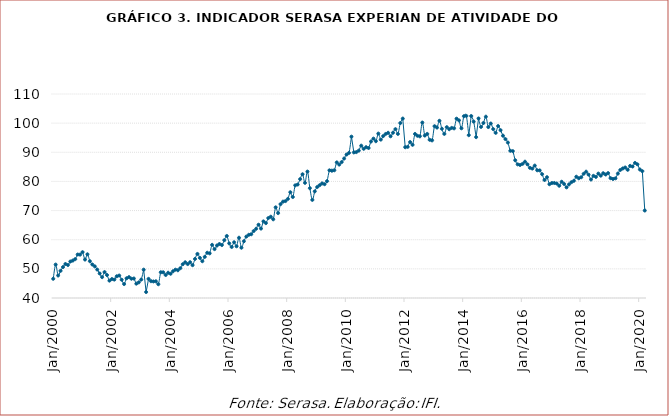
| Category | Indicador Serasa Experian de Atividade do Comércio |
|---|---|
| 2000-01-01 | 46.593 |
| 2000-02-01 | 51.465 |
| 2000-03-01 | 47.726 |
| 2000-04-01 | 49.323 |
| 2000-05-01 | 50.605 |
| 2000-06-01 | 51.668 |
| 2000-07-01 | 51.314 |
| 2000-08-01 | 52.513 |
| 2000-09-01 | 52.838 |
| 2000-10-01 | 53.339 |
| 2000-11-01 | 54.915 |
| 2000-12-01 | 54.885 |
| 2001-01-01 | 55.739 |
| 2001-02-01 | 53.199 |
| 2001-03-01 | 54.998 |
| 2001-04-01 | 52.62 |
| 2001-05-01 | 51.493 |
| 2001-06-01 | 50.86 |
| 2001-07-01 | 49.758 |
| 2001-08-01 | 48.418 |
| 2001-09-01 | 47.156 |
| 2001-10-01 | 48.903 |
| 2001-11-01 | 47.877 |
| 2001-12-01 | 45.954 |
| 2002-01-01 | 46.509 |
| 2002-02-01 | 46.311 |
| 2002-03-01 | 47.456 |
| 2002-04-01 | 47.695 |
| 2002-05-01 | 46.264 |
| 2002-06-01 | 44.786 |
| 2002-07-01 | 46.767 |
| 2002-08-01 | 47.166 |
| 2002-09-01 | 46.613 |
| 2002-10-01 | 46.681 |
| 2002-11-01 | 44.919 |
| 2002-12-01 | 45.37 |
| 2003-01-01 | 46.32 |
| 2003-02-01 | 49.722 |
| 2003-03-01 | 42.045 |
| 2003-04-01 | 46.567 |
| 2003-05-01 | 45.77 |
| 2003-06-01 | 45.681 |
| 2003-07-01 | 45.727 |
| 2003-08-01 | 44.732 |
| 2003-09-01 | 48.82 |
| 2003-10-01 | 48.819 |
| 2003-11-01 | 47.889 |
| 2003-12-01 | 48.665 |
| 2004-01-01 | 48.314 |
| 2004-02-01 | 49.176 |
| 2004-03-01 | 49.718 |
| 2004-04-01 | 49.525 |
| 2004-05-01 | 50.23 |
| 2004-06-01 | 51.596 |
| 2004-07-01 | 52.252 |
| 2004-08-01 | 51.641 |
| 2004-09-01 | 52.28 |
| 2004-10-01 | 51.261 |
| 2004-11-01 | 53.407 |
| 2004-12-01 | 55.122 |
| 2005-01-01 | 53.759 |
| 2005-02-01 | 52.626 |
| 2005-03-01 | 54.126 |
| 2005-04-01 | 55.519 |
| 2005-05-01 | 55.317 |
| 2005-06-01 | 58.235 |
| 2005-07-01 | 56.772 |
| 2005-08-01 | 58.013 |
| 2005-09-01 | 58.529 |
| 2005-10-01 | 58.165 |
| 2005-11-01 | 59.835 |
| 2005-12-01 | 61.285 |
| 2006-01-01 | 58.741 |
| 2006-02-01 | 57.505 |
| 2006-03-01 | 59.118 |
| 2006-04-01 | 57.743 |
| 2006-05-01 | 60.679 |
| 2006-06-01 | 57.252 |
| 2006-07-01 | 59.466 |
| 2006-08-01 | 61.065 |
| 2006-09-01 | 61.684 |
| 2006-10-01 | 61.88 |
| 2006-11-01 | 62.971 |
| 2006-12-01 | 63.75 |
| 2007-01-01 | 65.144 |
| 2007-02-01 | 63.83 |
| 2007-03-01 | 66.297 |
| 2007-04-01 | 65.696 |
| 2007-05-01 | 67.436 |
| 2007-06-01 | 67.884 |
| 2007-07-01 | 67.008 |
| 2007-08-01 | 71.11 |
| 2007-09-01 | 69.128 |
| 2007-10-01 | 72.222 |
| 2007-11-01 | 73.066 |
| 2007-12-01 | 73.253 |
| 2008-01-01 | 74.009 |
| 2008-02-01 | 76.293 |
| 2008-03-01 | 74.656 |
| 2008-04-01 | 78.656 |
| 2008-05-01 | 78.938 |
| 2008-06-01 | 80.784 |
| 2008-07-01 | 82.458 |
| 2008-08-01 | 79.515 |
| 2008-09-01 | 83.383 |
| 2008-10-01 | 77.68 |
| 2008-11-01 | 73.659 |
| 2008-12-01 | 76.593 |
| 2009-01-01 | 78.078 |
| 2009-02-01 | 78.727 |
| 2009-03-01 | 79.318 |
| 2009-04-01 | 79.05 |
| 2009-05-01 | 80.088 |
| 2009-06-01 | 83.806 |
| 2009-07-01 | 83.685 |
| 2009-08-01 | 83.829 |
| 2009-09-01 | 86.528 |
| 2009-10-01 | 85.772 |
| 2009-11-01 | 86.645 |
| 2009-12-01 | 87.856 |
| 2010-01-01 | 89.218 |
| 2010-02-01 | 89.799 |
| 2010-03-01 | 95.371 |
| 2010-04-01 | 89.953 |
| 2010-05-01 | 90.071 |
| 2010-06-01 | 90.575 |
| 2010-07-01 | 92.267 |
| 2010-08-01 | 91.184 |
| 2010-09-01 | 91.756 |
| 2010-10-01 | 91.462 |
| 2010-11-01 | 93.7 |
| 2010-12-01 | 94.689 |
| 2011-01-01 | 93.801 |
| 2011-02-01 | 96.414 |
| 2011-03-01 | 94.342 |
| 2011-04-01 | 95.566 |
| 2011-05-01 | 96.293 |
| 2011-06-01 | 96.68 |
| 2011-07-01 | 95.491 |
| 2011-08-01 | 96.718 |
| 2011-09-01 | 97.949 |
| 2011-10-01 | 96.303 |
| 2011-11-01 | 100.039 |
| 2011-12-01 | 101.566 |
| 2012-01-01 | 91.737 |
| 2012-02-01 | 91.863 |
| 2012-03-01 | 93.516 |
| 2012-04-01 | 92.556 |
| 2012-05-01 | 96.304 |
| 2012-06-01 | 95.668 |
| 2012-07-01 | 95.475 |
| 2012-08-01 | 100.203 |
| 2012-09-01 | 95.742 |
| 2012-10-01 | 96.299 |
| 2012-11-01 | 94.282 |
| 2012-12-01 | 94.09 |
| 2013-01-01 | 98.956 |
| 2013-02-01 | 98.49 |
| 2013-03-01 | 100.81 |
| 2013-04-01 | 98.062 |
| 2013-05-01 | 96.304 |
| 2013-06-01 | 98.628 |
| 2013-07-01 | 97.917 |
| 2013-08-01 | 98.363 |
| 2013-09-01 | 98.216 |
| 2013-10-01 | 101.529 |
| 2013-11-01 | 100.941 |
| 2013-12-01 | 98.233 |
| 2014-01-01 | 102.376 |
| 2014-02-01 | 102.476 |
| 2014-03-01 | 95.872 |
| 2014-04-01 | 102.445 |
| 2014-05-01 | 100.53 |
| 2014-06-01 | 95.192 |
| 2014-07-01 | 101.617 |
| 2014-08-01 | 98.711 |
| 2014-09-01 | 100.051 |
| 2014-10-01 | 102.215 |
| 2014-11-01 | 98.652 |
| 2014-12-01 | 99.862 |
| 2015-01-01 | 97.96 |
| 2015-02-01 | 96.661 |
| 2015-03-01 | 99.006 |
| 2015-04-01 | 97.575 |
| 2015-05-01 | 95.688 |
| 2015-06-01 | 94.528 |
| 2015-07-01 | 93.333 |
| 2015-08-01 | 90.517 |
| 2015-09-01 | 90.403 |
| 2015-10-01 | 87.256 |
| 2015-11-01 | 85.856 |
| 2015-12-01 | 85.645 |
| 2016-01-01 | 86.023 |
| 2016-02-01 | 86.769 |
| 2016-03-01 | 85.868 |
| 2016-04-01 | 84.667 |
| 2016-05-01 | 84.413 |
| 2016-06-01 | 85.43 |
| 2016-07-01 | 83.829 |
| 2016-08-01 | 83.785 |
| 2016-09-01 | 82.485 |
| 2016-10-01 | 80.486 |
| 2016-11-01 | 81.442 |
| 2016-12-01 | 79.044 |
| 2017-01-01 | 79.455 |
| 2017-02-01 | 79.462 |
| 2017-03-01 | 79.268 |
| 2017-04-01 | 78.517 |
| 2017-05-01 | 79.886 |
| 2017-06-01 | 79.135 |
| 2017-07-01 | 77.966 |
| 2017-08-01 | 78.983 |
| 2017-09-01 | 79.742 |
| 2017-10-01 | 80.218 |
| 2017-11-01 | 81.615 |
| 2017-12-01 | 81.09 |
| 2018-01-01 | 81.435 |
| 2018-02-01 | 82.617 |
| 2018-03-01 | 83.337 |
| 2018-04-01 | 82.337 |
| 2018-05-01 | 80.665 |
| 2018-06-01 | 81.912 |
| 2018-07-01 | 81.548 |
| 2018-08-01 | 82.685 |
| 2018-09-01 | 81.973 |
| 2018-10-01 | 82.812 |
| 2018-11-01 | 82.369 |
| 2018-12-01 | 82.862 |
| 2019-01-01 | 81.118 |
| 2019-02-01 | 80.848 |
| 2019-03-01 | 81.062 |
| 2019-04-01 | 82.7 |
| 2019-05-01 | 83.936 |
| 2019-06-01 | 84.459 |
| 2019-07-01 | 84.772 |
| 2019-08-01 | 83.984 |
| 2019-09-01 | 85.334 |
| 2019-10-01 | 85.117 |
| 2019-11-01 | 86.359 |
| 2019-12-01 | 85.867 |
| 2020-01-01 | 84.089 |
| 2020-02-01 | 83.532 |
| 2020-03-01 | 70.02 |